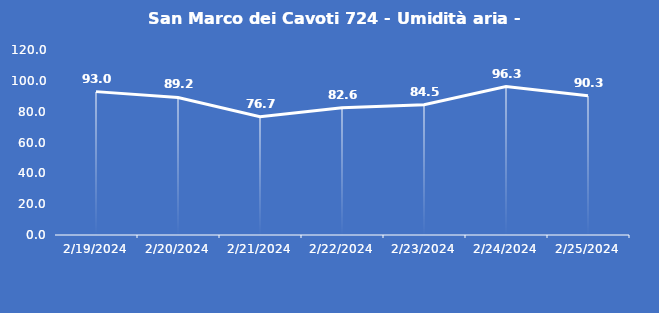
| Category | San Marco dei Cavoti 724 - Umidità aria - Grezzo (%) |
|---|---|
| 2/19/24 | 93 |
| 2/20/24 | 89.2 |
| 2/21/24 | 76.7 |
| 2/22/24 | 82.6 |
| 2/23/24 | 84.5 |
| 2/24/24 | 96.3 |
| 2/25/24 | 90.3 |